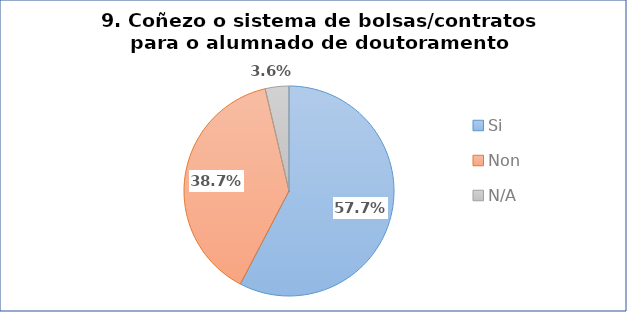
| Category | Pregunta 9. Coñezo o sistema de bolsas/contratos da etapa de formación para o alumnado de doutoramento |
|---|---|
| Si | 0.577 |
| Non | 0.387 |
| N/A | 0.036 |